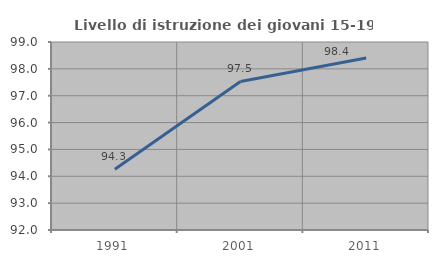
| Category | Livello di istruzione dei giovani 15-19 anni |
|---|---|
| 1991.0 | 94.264 |
| 2001.0 | 97.531 |
| 2011.0 | 98.404 |